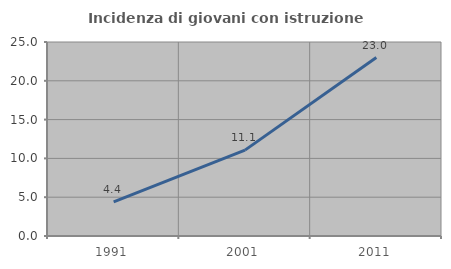
| Category | Incidenza di giovani con istruzione universitaria |
|---|---|
| 1991.0 | 4.39 |
| 2001.0 | 11.067 |
| 2011.0 | 23 |